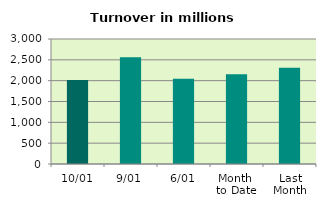
| Category | Series 0 |
|---|---|
| 10/01 | 2017.24 |
| 9/01 | 2562.509 |
| 6/01 | 2047.455 |
| Month 
to Date | 2155.646 |
| Last
Month | 2310.602 |